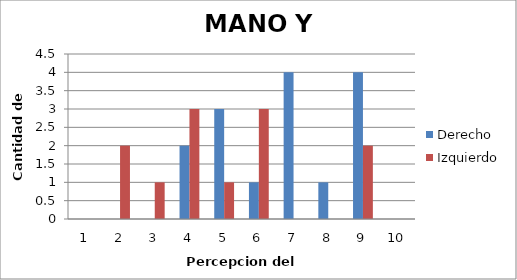
| Category | Derecho  | Izquierdo |
|---|---|---|
| 0 | 0 | 0 |
| 1 | 0 | 2 |
| 2 | 0 | 1 |
| 3 | 2 | 3 |
| 4 | 3 | 1 |
| 5 | 1 | 3 |
| 6 | 4 | 0 |
| 7 | 1 | 0 |
| 8 | 4 | 2 |
| 9 | 0 | 0 |